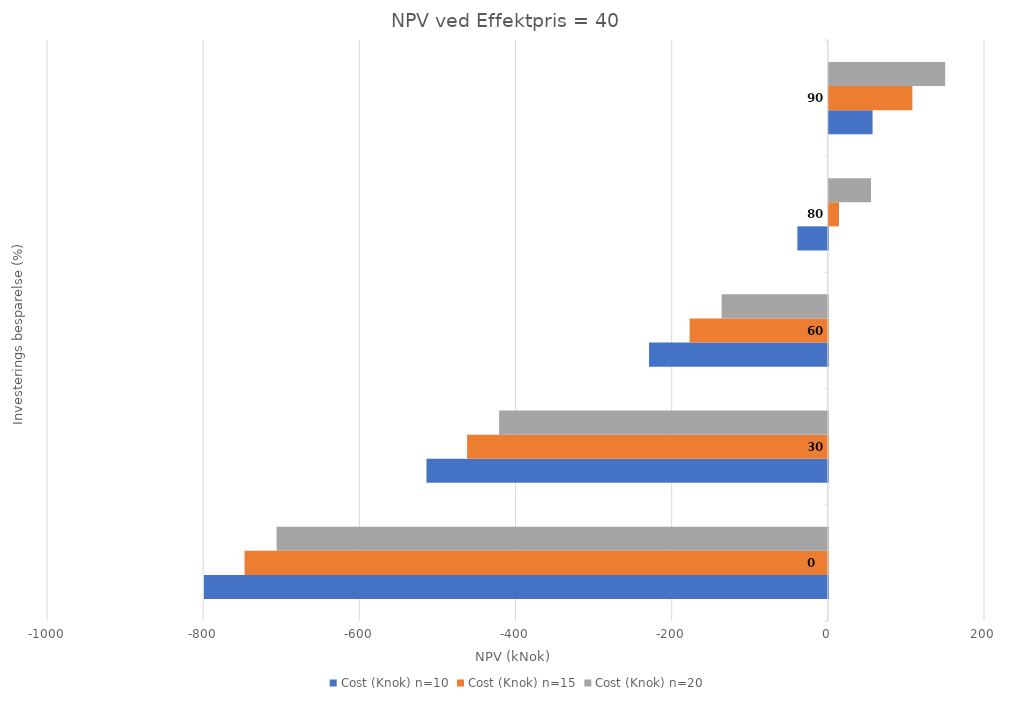
| Category | Cost (Knok) n=10 | Cost (Knok) n=15 | Cost (Knok) n=20 |
|---|---|---|---|
| 0.0 | -799 | -747 | -706 |
| 30.0 | -514 | -462 | -421 |
| 60.0 | -229 | -177 | -136 |
| 80.0 | -39 | 13 | 54 |
| 90.0 | 56 | 107 | 149 |